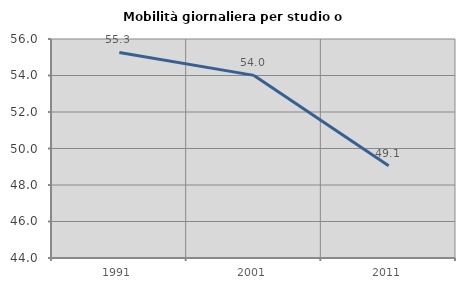
| Category | Mobilità giornaliera per studio o lavoro |
|---|---|
| 1991.0 | 55.264 |
| 2001.0 | 54.006 |
| 2011.0 | 49.053 |